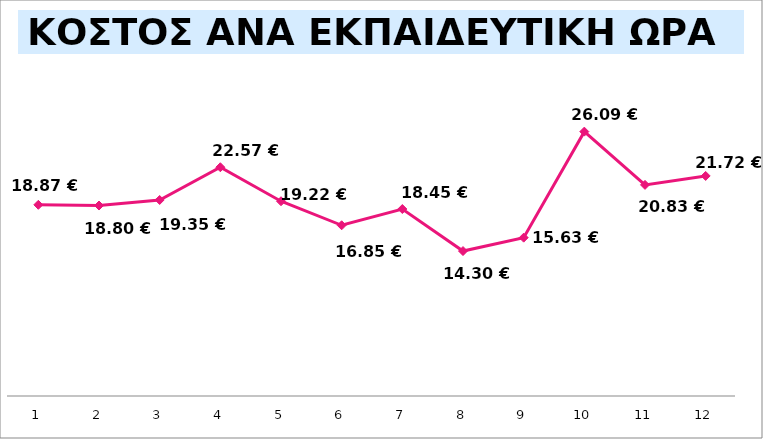
| Category |   ΚΟΣΤΟΣ / ΔΙΔΑΚΤΙΚΗ ΩΡΑ   |
|---|---|
| 0 | 18.868 |
| 1 | 18.797 |
| 2 | 19.345 |
| 3 | 22.575 |
| 4 | 19.22 |
| 5 | 16.848 |
| 6 | 18.452 |
| 7 | 14.304 |
| 8 | 15.625 |
| 9 | 26.089 |
| 10 | 20.834 |
| 11 | 21.718 |